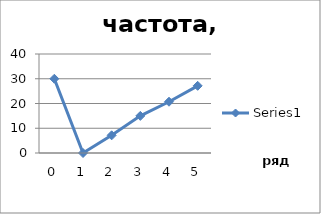
| Category | Series 0 |
|---|---|
| 0.0 | 30 |
| 1.0 | 0 |
| 2.0 | 7.143 |
| 3.0 | 15 |
| 4.0 | 20.714 |
| 5.0 | 27.143 |